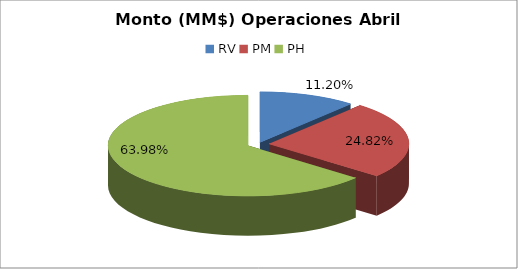
| Category | Series 0 |
|---|---|
| RV | 1141759.31 |
| PM | 2531020.855 |
| PH | 6524406.619 |